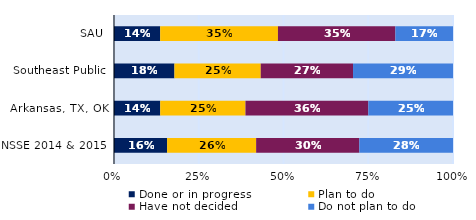
| Category | Done or in progress | Plan to do | Have not decided | Do not plan to do |
|---|---|---|---|---|
| SAU | 0.136 | 0.347 | 0.346 | 0.17 |
| Southeast Public | 0.178 | 0.255 | 0.272 | 0.295 |
| Arkansas, TX, OK | 0.136 | 0.251 | 0.363 | 0.25 |
| NSSE 2014 & 2015 | 0.157 | 0.263 | 0.304 | 0.276 |